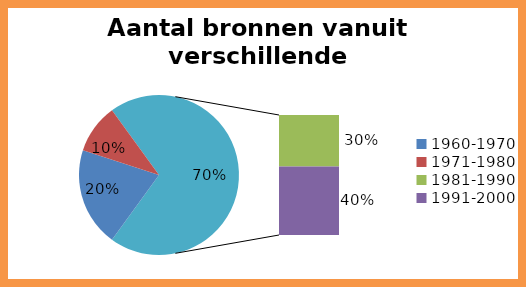
| Category | Aantal  |
|---|---|
| 1960-1970 | 2 |
| 1971-1980 | 1 |
| 1981-1990 | 3 |
| 1991-2000 | 4 |